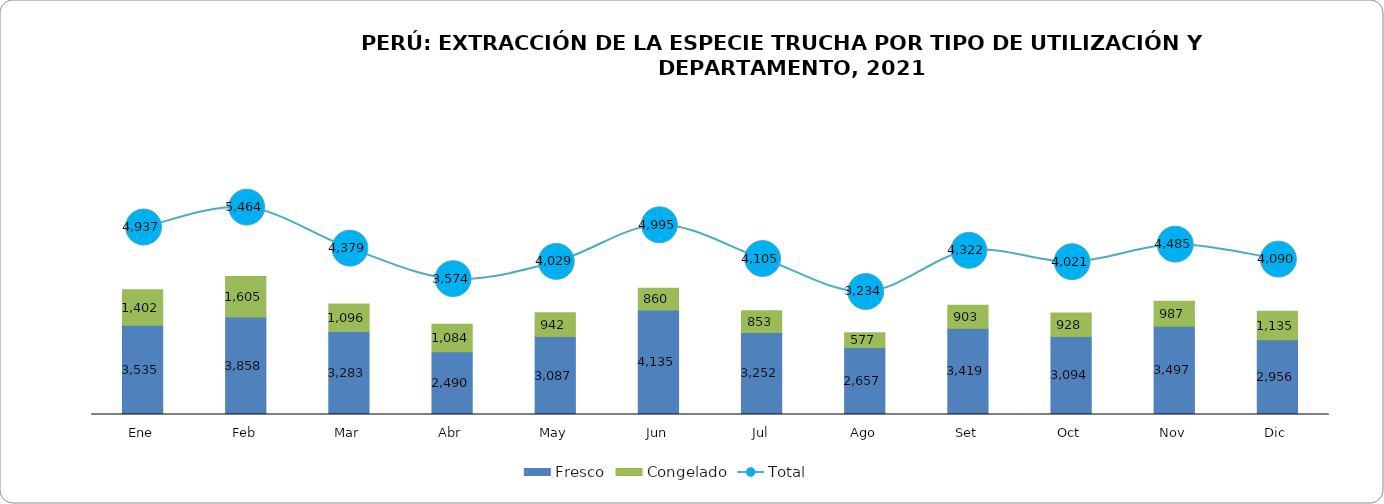
| Category | Fresco | Congelado |
|---|---|---|
| Ene | 3535.138 | 1402.013 |
| Feb | 3858.479 | 1605.055 |
| Mar | 3283.344 | 1095.843 |
| Abr | 2490.004 | 1084.374 |
| May | 3087.054 | 942.085 |
| Jun | 4135.468 | 859.821 |
| Jul | 3251.937 | 853.354 |
| Ago | 2657.033 | 577.402 |
| Set | 3418.815 | 903.356 |
| Oct | 3093.646 | 927.582 |
| Nov | 3497.389 | 987.342 |
| Dic | 2955.603 | 1134.508 |